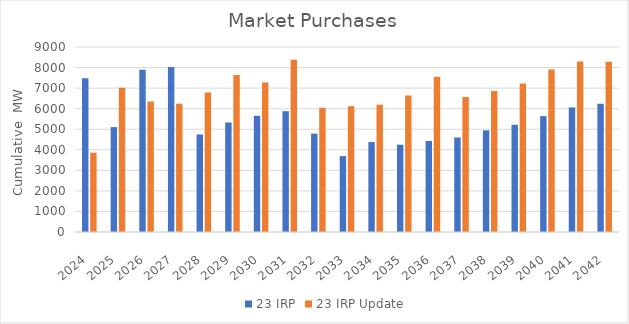
| Category | 23 IRP | 23 IRP Update |
|---|---|---|
| 2024.0 | 7477.756 | 3858.542 |
| 2025.0 | 5102.434 | 7019.831 |
| 2026.0 | 7896.304 | 6346.074 |
| 2027.0 | 8029.036 | 6238.901 |
| 2028.0 | 4746.55 | 6785.14 |
| 2029.0 | 5329.714 | 7633.043 |
| 2030.0 | 5654.135 | 7278.98 |
| 2031.0 | 5876.9 | 8374.684 |
| 2032.0 | 4786.976 | 6046.696 |
| 2033.0 | 3690.853 | 6122.317 |
| 2034.0 | 4374.56 | 6195.483 |
| 2035.0 | 4246.356 | 6646.494 |
| 2036.0 | 4428.577 | 7549.536 |
| 2037.0 | 4599.963 | 6569.624 |
| 2038.0 | 4946.709 | 6865.494 |
| 2039.0 | 5217.987 | 7222.887 |
| 2040.0 | 5637.619 | 7903.758 |
| 2041.0 | 6063.613 | 8300.077 |
| 2042.0 | 6243.202 | 8286.668 |